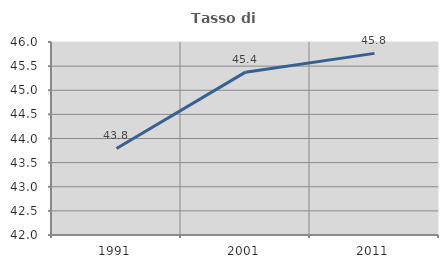
| Category | Tasso di occupazione   |
|---|---|
| 1991.0 | 43.794 |
| 2001.0 | 45.375 |
| 2011.0 | 45.764 |